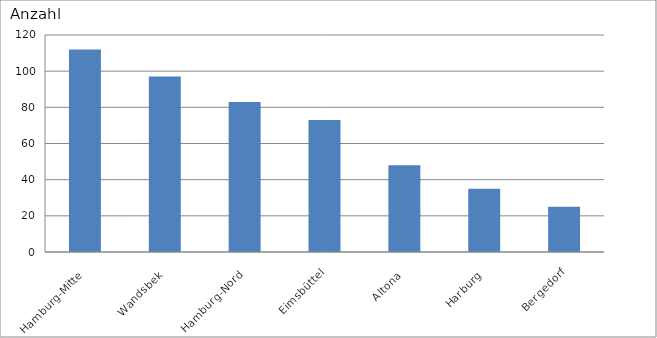
| Category | Hamburg-Mitte Wandsbek Hamburg-Nord Eimsbüttel Altona Harburg Bergedorf |
|---|---|
| Hamburg-Mitte | 112 |
| Wandsbek | 97 |
| Hamburg-Nord | 83 |
| Eimsbüttel | 73 |
| Altona | 48 |
| Harburg | 35 |
| Bergedorf | 25 |